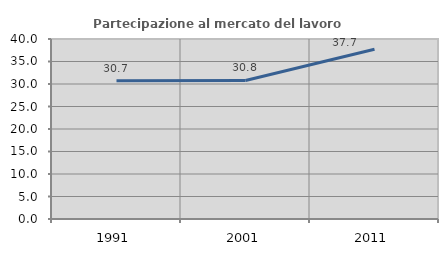
| Category | Partecipazione al mercato del lavoro  femminile |
|---|---|
| 1991.0 | 30.703 |
| 2001.0 | 30.792 |
| 2011.0 | 37.709 |